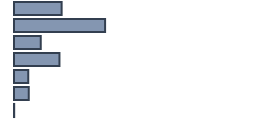
| Category | Percentatge |
|---|---|
| 0 | 19.848 |
| 1 | 37.955 |
| 2 | 11.136 |
| 3 | 18.939 |
| 4 | 5.909 |
| 5 | 6.136 |
| 6 | 0.076 |